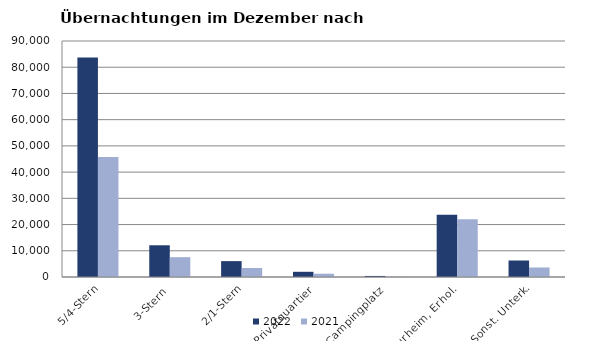
| Category | 2022 | 2021 |
|---|---|---|
| 5/4-Stern | 83717 | 45719 |
| 3-Stern | 12096 | 7563 |
| 2/1-Stern | 6055 | 3439 |
| Privatquartier | 1982 | 1248 |
| Campingplatz | 399 | 63 |
| Kurheim, Erhol. | 23694 | 22005 |
| Sonst. Unterk. | 6293 | 3624 |